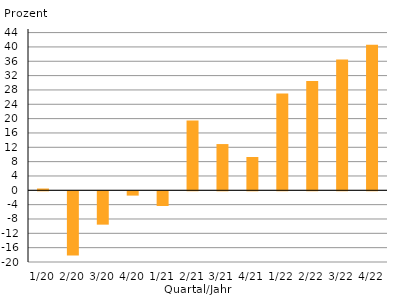
| Category | Veränd. zum Vorjahresquartal in Prozent |
|---|---|
| 1/20 | 0.5 |
| 2/20 | -17.9 |
| 3/20 | -9.3 |
| 4/20 | -1.2 |
| 1/21 | -4.1 |
| 2/21 | 19.5 |
| 3/21 | 12.9 |
| 4/21 | 9.3 |
| 1/22 | 27 |
| 2/22 | 30.5 |
| 3/22 | 36.5 |
| 4/22 | 40.6 |